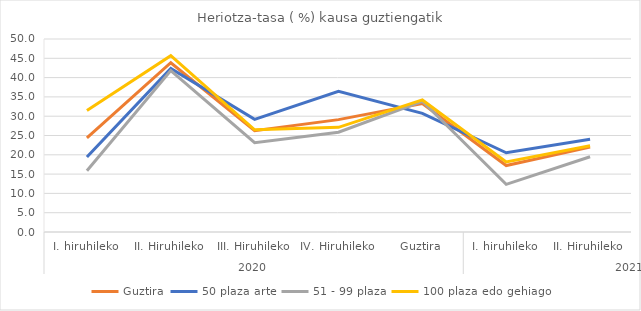
| Category | Guztira | 50 plaza arte | 51 - 99 plaza | 100 plaza edo gehiago |
|---|---|---|---|---|
| 0 | 24.387 | 19.431 | 15.848 | 31.46 |
| 1 | 43.85 | 42.391 | 41.801 | 45.692 |
| 2 | 26.257 | 29.172 | 23.128 | 26.464 |
| 3 | 29.109 | 36.436 | 25.842 | 27.114 |
| 4 | 33.252 | 30.722 | 33.876 | 34.211 |
| 5 | 17.215 | 20.517 | 12.333 | 18.166 |
| 6 | 21.996 | 24.003 | 19.492 | 22.354 |